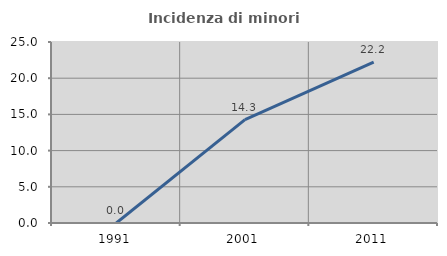
| Category | Incidenza di minori stranieri |
|---|---|
| 1991.0 | 0 |
| 2001.0 | 14.286 |
| 2011.0 | 22.222 |